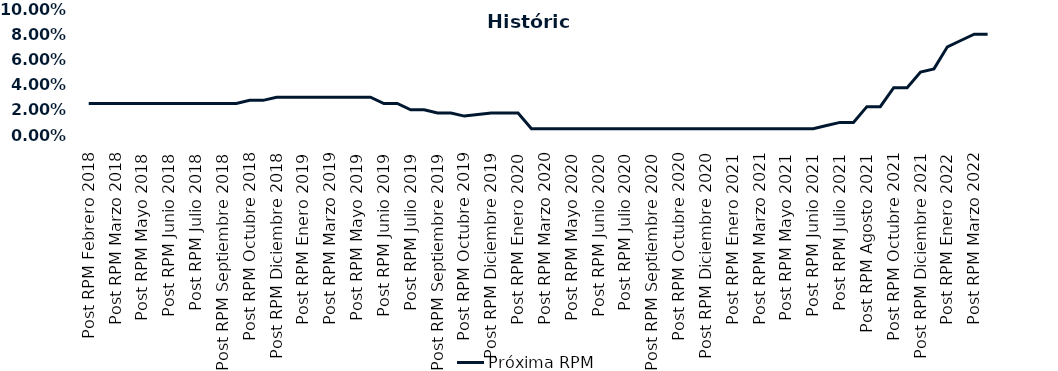
| Category | Próxima RPM |
|---|---|
| Post RPM Febrero 2018 | 0.025 |
| Pre RPM Marzo 2018 | 0.025 |
| Post RPM Marzo 2018 | 0.025 |
| Pre RPM Mayo 2018 | 0.025 |
| Post RPM Mayo 2018 | 0.025 |
| Pre RPM Junio 2018 | 0.025 |
| Post RPM Junio 2018 | 0.025 |
| Pre RPM Julio 2018 | 0.025 |
| Post RPM Julio 2018 | 0.025 |
| Pre RPM Septiembre 2018 | 0.025 |
| Post RPM Septiembre 2018 | 0.025 |
| Pre RPM Octubre 2018 | 0.025 |
| Post RPM Octubre 2018 | 0.028 |
| Pre RPM Diciembre 2018 | 0.028 |
| Post RPM Diciembre 2018 | 0.03 |
| Pre RPM Enero 2019 | 0.03 |
| Post RPM Enero 2019 | 0.03 |
| Pre RPM Marzo 2019 | 0.03 |
| Post RPM Marzo 2019 | 0.03 |
| Pre RPM Mayo 2019 | 0.03 |
| Post RPM Mayo 2019 | 0.03 |
| Pre RPM Junio 2019 | 0.03 |
| Post RPM Junio 2019 | 0.025 |
| Pre RPM Julio 2019 | 0.025 |
| Post RPM Julio 2019 | 0.02 |
| Pre RPM Septiembre 2019 | 0.02 |
| Post RPM Septiembre 2019 | 0.018 |
| Pre RPM Octubre 2019 | 0.018 |
| Post RPM Octubre 2019 | 0.015 |
| Pre RPM Diciembre 2019 | 0.016 |
| Post RPM Diciembre 2019 | 0.018 |
| Pre RPM Enero 2020 | 0.018 |
| Post RPM Enero 2020 | 0.018 |
| Pre RPM Marzo 2020 | 0.005 |
| Post RPM Marzo 2020 | 0.005 |
| Pre RPM Mayo 2020 | 0.005 |
| Post RPM Mayo 2020 | 0.005 |
| Pre RPM Junio 2020 | 0.005 |
| Post RPM Junio 2020 | 0.005 |
| Pre RPM Julio 2020 | 0.005 |
| Post RPM Julio 2020 | 0.005 |
| Pre RPM Septiembre 2020 | 0.005 |
| Post RPM Septiembre 2020 | 0.005 |
| Pre RPM Octubre 2020 | 0.005 |
| Post RPM Octubre 2020 | 0.005 |
| Pre RPM Diciembre 2020 | 0.005 |
| Post RPM Diciembre 2020 | 0.005 |
| Pre RPM Enero 2021 | 0.005 |
| Post RPM Enero 2021 | 0.005 |
| Pre RPM Marzo 2021 | 0.005 |
| Post RPM Marzo 2021 | 0.005 |
| Pre RPM Mayo 2021 | 0.005 |
| Post RPM Mayo 2021 | 0.005 |
| Pre RPM Junio 2021 | 0.005 |
| Post RPM Junio 2021 | 0.005 |
| Pre RPM Julio 2021 | 0.008 |
| Post RPM Julio 2021 | 0.01 |
| Pre RPM Agosto 2021 | 0.01 |
| Post RPM Agosto 2021 | 0.022 |
| Pre RPM Octubre 2021 | 0.022 |
| Post RPM Octubre 2021 | 0.038 |
| Pre RPM Diciembre 2021 | 0.038 |
| Post RPM Diciembre 2021 | 0.05 |
| Pre RPM Enero 2022 | 0.052 |
| Post RPM Enero 2022 | 0.07 |
| Pre RPM Marzo 2022 | 0.075 |
| Post RPM Marzo 2022 | 0.08 |
| Pre RPM Mayo 2022 | 0.08 |